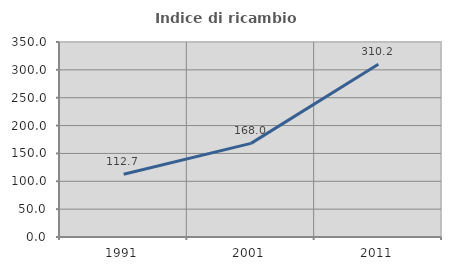
| Category | Indice di ricambio occupazionale  |
|---|---|
| 1991.0 | 112.736 |
| 2001.0 | 168.027 |
| 2011.0 | 310.204 |